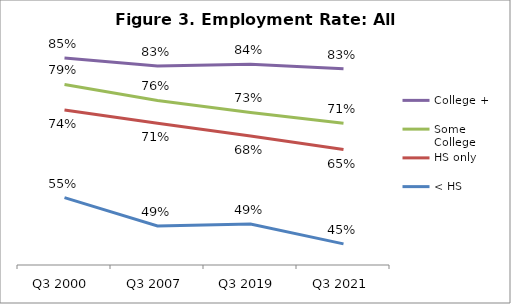
| Category | College + | Some College | HS only | < HS |
|---|---|---|---|---|
| Q3 2000 | 0.852 | 0.794 | 0.738 | 0.547 |
| Q3 2007 | 0.834 | 0.759 | 0.709 | 0.485 |
| Q3 2019 | 0.838 | 0.733 | 0.682 | 0.49 |
| Q3 2021 | 0.828 | 0.709 | 0.652 | 0.446 |